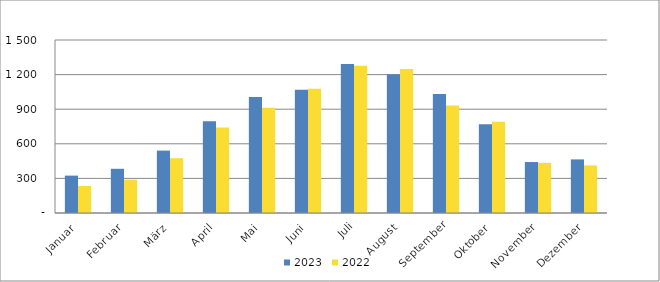
| Category | 2023 | 2022 |
|---|---|---|
| Januar | 324122 | 233736 |
| Februar | 383239 | 288901 |
| März | 541057 | 475154 |
| April | 795303 | 742233 |
| Mai | 1004990 | 913016 |
| Juni | 1068768 | 1077843 |
| Juli | 1291910 | 1277761 |
| August | 1201306 | 1248547 |
| September | 1030916 | 931669 |
| Oktober | 769713 | 792262 |
| November | 441677 | 434868 |
| Dezember | 464723 | 412847 |